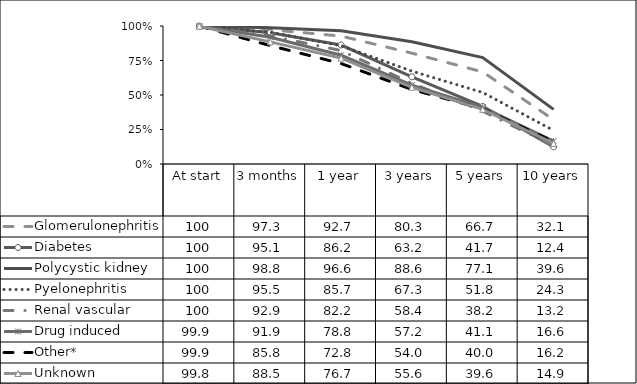
| Category | Glomerulonephritis | Diabetes | Polycystic kidney | Pyelonephritis | Renal vascular | Drug induced | Other* | Unknown |
|---|---|---|---|---|---|---|---|---|
| At start | 100 | 100 | 100 | 100 | 100 | 99.9 | 99.9 | 99.8 |
| 3 months | 97.3 | 95.1 | 98.8 | 95.5 | 92.9 | 91.9 | 85.8 | 88.5 |
| 1 year | 92.7 | 86.2 | 96.6 | 85.7 | 82.2 | 78.8 | 72.8 | 76.7 |
| 3 years | 80.3 | 63.2 | 88.6 | 67.3 | 58.4 | 57.2 | 54 | 55.6 |
| 5 years | 66.7 | 41.7 | 77.1 | 51.8 | 38.2 | 41.1 | 40 | 39.6 |
| 10 years | 32.1 | 12.4 | 39.6 | 24.3 | 13.2 | 16.6 | 16.2 | 14.9 |